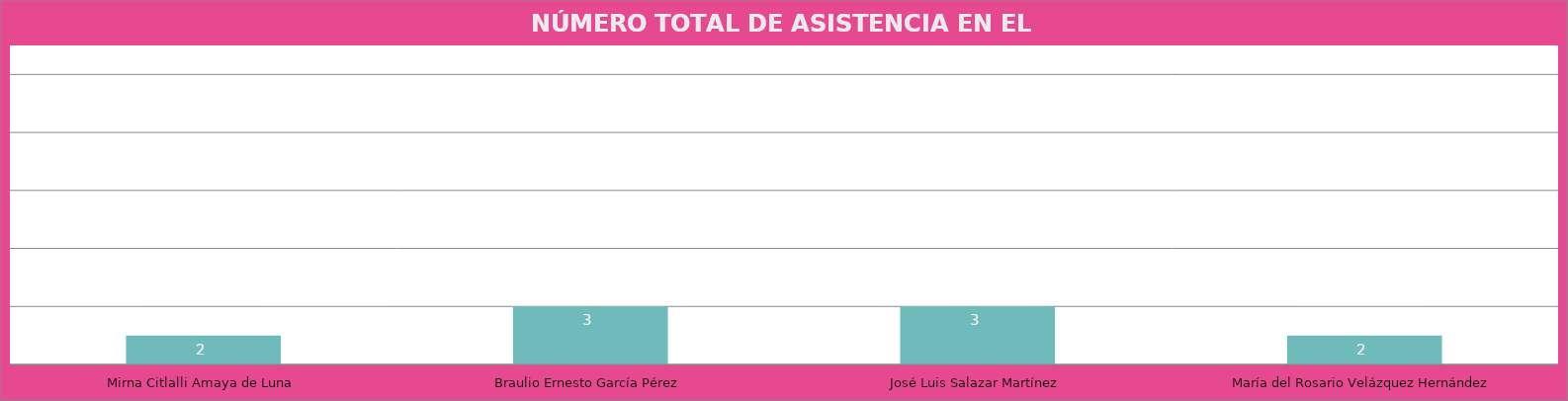
| Category | Mirna Citlalli Amaya de Luna |
|---|---|
| Mirna Citlalli Amaya de Luna | 2 |
| Braulio Ernesto García Pérez | 3 |
| José Luis Salazar Martínez | 3 |
| María del Rosario Velázquez Hernández | 2 |